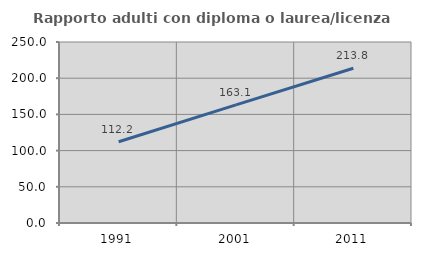
| Category | Rapporto adulti con diploma o laurea/licenza media  |
|---|---|
| 1991.0 | 112.245 |
| 2001.0 | 163.077 |
| 2011.0 | 213.806 |